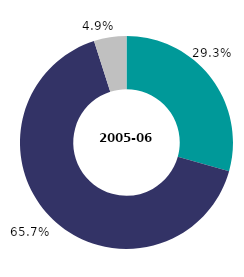
| Category | 2005-06 |
|---|---|
| single persons | 29.335 |
| couples | 65.732 |
| other types of households | 4.933 |